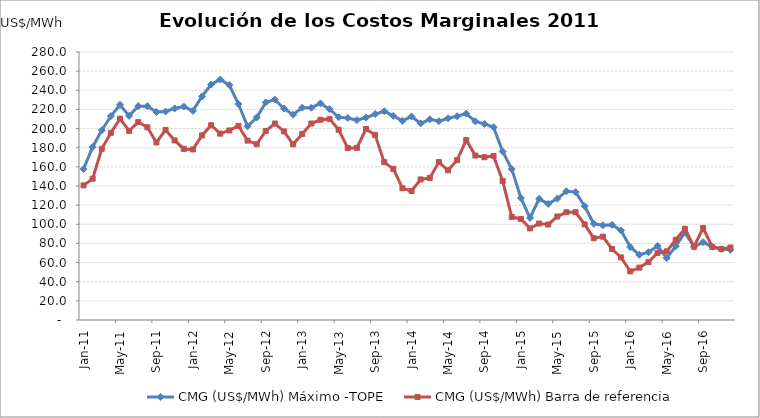
| Category | CMG (US$/MWh) Máximo -TOPE | CMG (US$/MWh) Barra de referencia |
|---|---|---|
| 2011-01-01 | 157.708 | 140.639 |
| 2011-02-01 | 180.807 | 147.614 |
| 2011-03-01 | 198.184 | 178.814 |
| 2011-04-01 | 213.042 | 195.562 |
| 2011-05-01 | 224.834 | 210.332 |
| 2011-06-01 | 213.27 | 197.63 |
| 2011-07-01 | 223.438 | 206.806 |
| 2011-08-01 | 223.369 | 201.332 |
| 2011-09-01 | 217.323 | 185.522 |
| 2011-10-01 | 217.803 | 198.535 |
| 2011-11-01 | 221.02 | 187.636 |
| 2011-12-01 | 223.002 | 178.745 |
| 2012-01-01 | 218.47 | 178.223 |
| 2012-02-01 | 233.6 | 192.871 |
| 2012-03-01 | 246.07 | 203.53 |
| 2012-04-01 | 251.23 | 194.688 |
| 2012-05-01 | 245.44 | 198.046 |
| 2012-06-01 | 225.62 | 202.791 |
| 2012-07-01 | 202.35 | 187.407 |
| 2012-08-01 | 211.59 | 183.594 |
| 2012-09-01 | 227.33 | 197.519 |
| 2012-10-01 | 230.25 | 205.275 |
| 2012-11-01 | 220.99 | 197.03 |
| 2012-12-01 | 214.51 | 183.538 |
| 2013-01-01 | 221.86 | 194.4 |
| 2013-02-01 | 221.79 | 205.3 |
| 2013-03-01 | 226.35 | 209.2 |
| 2013-04-01 | 220.3 | 210.1 |
| 2013-05-01 | 211.83 | 198.7 |
| 2013-06-01 | 211.1 | 179.6 |
| 2013-07-01 | 208.84 | 179.8 |
| 2013-08-01 | 211.53 | 199.6 |
| 2013-09-01 | 215.15 | 193.4 |
| 2013-10-01 | 218.13 | 164.9 |
| 2013-11-01 | 213.24 | 157.9 |
| 2013-12-01 | 208.06 | 137.696 |
| 2014-01-01 | 212.67 | 134.746 |
| 2014-02-01 | 205.39 | 146.869 |
| 2014-03-01 | 209.7 | 148.45 |
| 2014-04-01 | 207.76 | 165.047 |
| 2014-05-01 | 210.78 | 156.398 |
| 2014-06-01 | 212.95 | 166.999 |
| 2014-07-01 | 215.69 | 187.953 |
| 2014-08-01 | 207.54 | 171.817 |
| 2014-09-01 | 204.87 | 170.068 |
| 2014-10-01 | 201.37 | 171.429 |
| 2014-11-01 | 176 | 145.313 |
| 2014-12-01 | 157.67 | 107.601 |
| 2015-01-01 | 127.47 | 105.546 |
| 2015-02-01 | 106.63 | 95.7 |
| 2015-03-01 | 126.58 | 100.8 |
| 2015-04-01 | 121.28 | 99.8 |
| 2015-05-01 | 126.82 | 108.1 |
| 2015-06-01 | 134.46 | 112.6 |
| 2015-07-01 | 133.6 | 112.6 |
| 2015-08-01 | 118.86 | 99.9 |
| 2015-09-01 | 100.53 | 85.4 |
| 2015-10-01 | 98.95 | 87.1 |
| 2015-11-01 | 99.37 | 74.2 |
| 2015-12-01 | 93.56 | 65.4 |
| 2016-01-01 | 76.21 | 50.8 |
| 2016-02-01 | 68.18 | 54.7 |
| 2016-03-01 | 70.84 | 60.5 |
| 2016-04-01 | 77.38 | 70.1 |
| 2016-05-01 | 64.655 | 71.721 |
| 2016-06-01 | 77.108 | 83.82 |
| 2016-07-01 | 91.586 | 95.331 |
| 2016-08-01 | 76.489 | 76.631 |
| 2016-09-01 | 81.371 | 96.113 |
| 2016-10-01 | 76.417 | 76.417 |
| 2016-11-01 | 74.137 | 74.137 |
| 2016-12-01 | 73.291 | 75.724 |